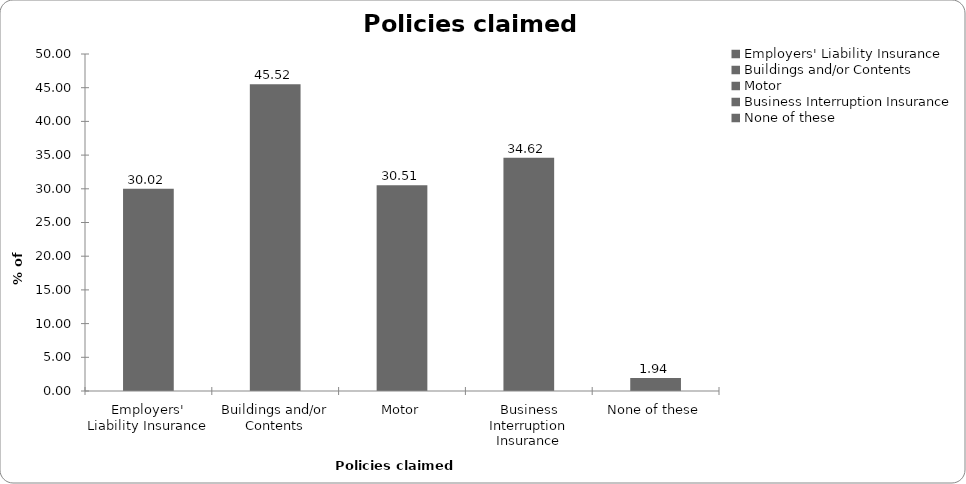
| Category | Series 0 |
|---|---|
| Employers' Liability Insurance | 30.024 |
| Buildings and/or Contents | 45.521 |
| Motor | 30.508 |
| Business Interruption Insurance | 34.625 |
| None of these | 1.937 |